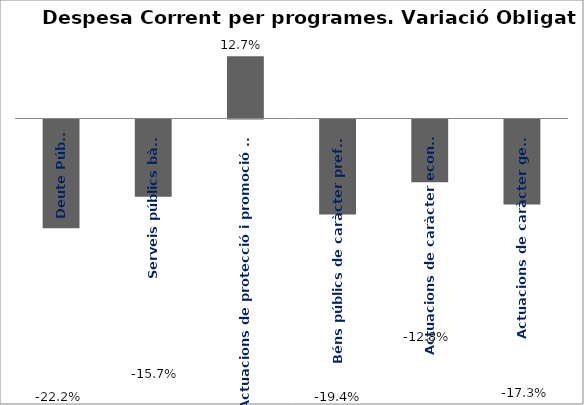
| Category | Series 0 |
|---|---|
| Deute Públic | -0.222 |
| Serveis públics bàsics | -0.157 |
| Actuacions de protecció i promoció social | 0.127 |
| Béns públics de caràcter preferent | -0.194 |
| Actuacions de caràcter econòmic | -0.128 |
| Actuacions de caràcter general | -0.173 |